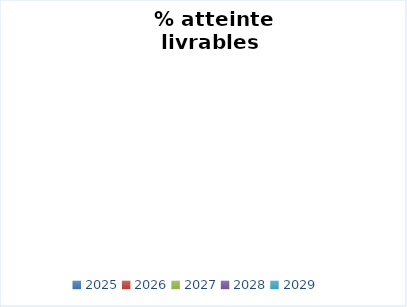
| Category | Series 0 |
|---|---|
| 2025.0 | 0 |
| 2026.0 | 0 |
| 2027.0 | 0 |
| 2028.0 | 0 |
| 2029.0 | 0 |